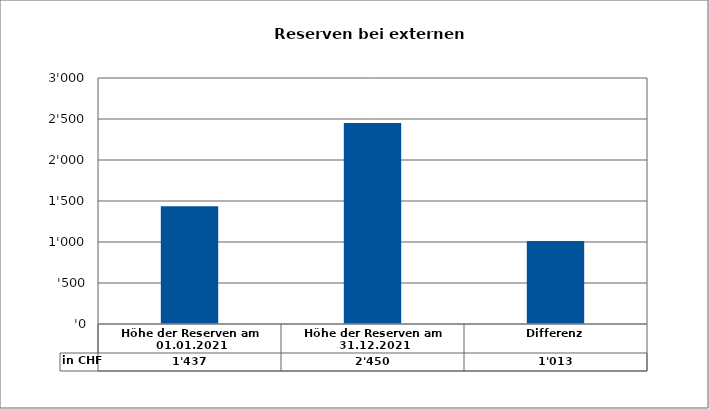
| Category | in CHF |
|---|---|
| Höhe der Reserven am 01.01.2021 | 1437 |
| Höhe der Reserven am 31.12.2021 | 2450 |
| Differenz | 1013 |